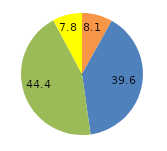
| Category | Series 0 |
|---|---|
| 0 | 8.1 |
| 1 | 39.6 |
| 2 | 44.4 |
| 3 | 7.8 |